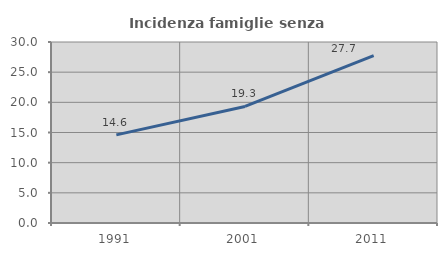
| Category | Incidenza famiglie senza nuclei |
|---|---|
| 1991.0 | 14.608 |
| 2001.0 | 19.315 |
| 2011.0 | 27.744 |